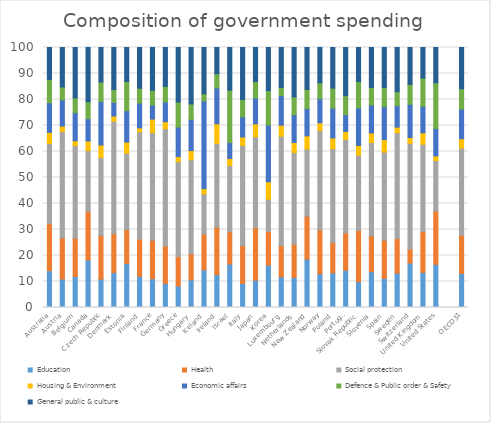
| Category | Education  | Health  | Social protection | Housing & Environment | Economic affairs | Defence & Public order & Safety | General public & culture |
|---|---|---|---|---|---|---|---|
| Australia | 14.123 | 18.117 | 30.847 | 4.289 | 11.369 | 8.952 | 12.303 |
| Austria | 10.92 | 15.86 | 40.86 | 2.13 | 10.02 | 5.04 | 15.17 |
| Belgium | 11.9 | 14.74 | 35.61 | 1.89 | 10.77 | 5.73 | 19.35 |
| Canada | 18.29 | 18.67 | 23.35 | 3.73 | 8.56 | 6.56 | 20.83 |
| Czech Republic | 10.88 | 16.82 | 29.96 | 4.84 | 16.79 | 7.43 | 13.29 |
| Denmark | 13.44 | 14.93 | 43.26 | 2.02 | 5.21 | 4.96 | 16.17 |
| Estonia | 16.87 | 13.09 | 29.35 | 4.29 | 12.08 | 11.24 | 13.07 |
| Finland | 12 | 14.27 | 41.32 | 1.49 | 9.52 | 5.73 | 15.66 |
| France | 11.06 | 14.79 | 41.42 | 5.2 | 5.41 | 5.64 | 16.48 |
| Germany | 9.27 | 14.34 | 45.12 | 2.72 | 7.56 | 6 | 14.99 |
| Greece | 8.27 | 11.35 | 36.45 | 1.96 | 11.35 | 9.66 | 20.96 |
| Hungary | 10.67 | 9.98 | 36.16 | 3.54 | 11.97 | 5.98 | 21.7 |
| Iceland | 14.48 | 13.74 | 15.45 | 2.03 | 33.75 | 2.73 | 17.81 |
| Ireland | 12.61 | 18.25 | 32.25 | 7.54 | 13.8 | 5.5 | 10.05 |
| Israel | 16.71 | 12.43 | 25.51 | 2.67 | 6.1 | 20.18 | 16.4 |
| Italy | 9.25 | 14.57 | 38.49 | 3.27 | 7.75 | 6.66 | 20.01 |
| Japan | 10.52 | 20.13 | 35.01 | 4.95 | 9.95 | 6.36 | 13.08 |
| Korea | 16.26 | 12.95 | 12.43 | 6.71 | 21.8 | 13.28 | 16.57 |
| Luxembourg | 11.81 | 11.99 | 42.09 | 4.25 | 11.36 | 3.08 | 15.42 |
| Netherlands | 11.6 | 12.72 | 35.23 | 3.91 | 10.7 | 6.85 | 18.98 |
| New Zealand | 18.58 | 16.56 | 25.79 | 5.09 | 10.45 | 7.4 | 16.12 |
| Norway | 12.99 | 16.85 | 38.17 | 3.02 | 9.24 | 6.14 | 13.59 |
| Poland | 13.29 | 11.69 | 36.11 | 4.11 | 11.46 | 7.73 | 15.61 |
| Portugal | 14.33 | 14.37 | 35.93 | 3.08 | 6.46 | 7.29 | 18.54 |
| Slovak Republic | 9.92 | 19.72 | 28.97 | 3.72 | 14.43 | 10.13 | 13.11 |
| Slovenia | 13.79 | 13.77 | 35.89 | 3.69 | 10.72 | 6.8 | 15.34 |
| Spain | 11.2 | 14.7 | 33.85 | 4.82 | 12.62 | 7.41 | 15.4 |
| Sweden | 13.23 | 13.27 | 40.74 | 2.15 | 8.17 | 5.45 | 17 |
| Switzerland | 17.07 | 5.35 | 40.73 | 2.22 | 12.8 | 7.63 | 14.2 |
| United Kingdom | 13.47 | 15.79 | 33.5 | 4.45 | 10.18 | 10.86 | 11.76 |
| United States | 16.6 | 20.53 | 19.39 | 1.78 | 10.55 | 17.61 | 13.54 |
|  | 0 | 0 | 0 | 0 | 0 | 0 | 0 |
| OECD31 | 13.078 | 14.721 | 33.524 | 3.599 | 11.384 | 7.807 | 15.887 |